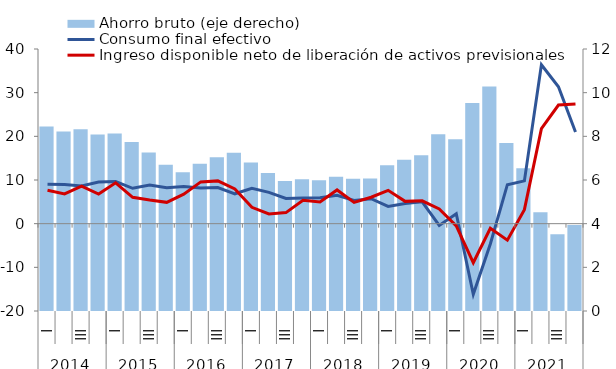
| Category | Ahorro bruto (eje derecho) |
|---|---|
| 0 | 8.448 |
| 1 | 8.221 |
| 2 | 8.33 |
| 3 | 8.08 |
| 4 | 8.127 |
| 5 | 7.743 |
| 6 | 7.259 |
| 7 | 6.697 |
| 8 | 6.354 |
| 9 | 6.748 |
| 10 | 7.041 |
| 11 | 7.245 |
| 12 | 6.8 |
| 13 | 6.318 |
| 14 | 5.956 |
| 15 | 6.038 |
| 16 | 5.99 |
| 17 | 6.146 |
| 18 | 6.062 |
| 19 | 6.073 |
| 20 | 6.674 |
| 21 | 6.927 |
| 22 | 7.138 |
| 23 | 8.091 |
| 24 | 7.866 |
| 25 | 9.528 |
| 26 | 10.285 |
| 27 | 7.696 |
| 28 | 6.535 |
| 29 | 4.525 |
| 30 | 3.511 |
| 31 | 3.938 |